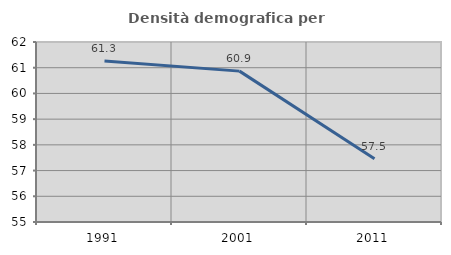
| Category | Densità demografica |
|---|---|
| 1991.0 | 61.264 |
| 2001.0 | 60.867 |
| 2011.0 | 57.459 |